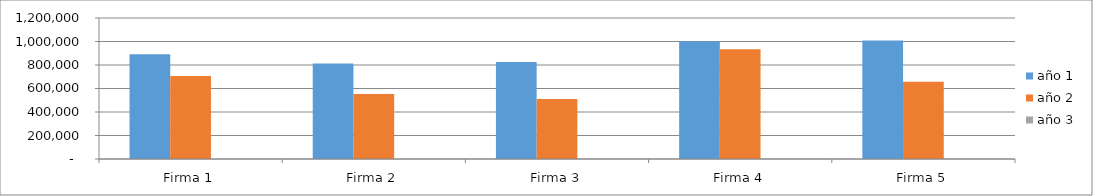
| Category | año 1 | año 2 | año 3 |
|---|---|---|---|
| Firma 1 | 890450.022 | 707381.085 | 0 |
| Firma 2 | 812025.331 | 553745.113 | 0 |
| Firma 3 | 825124.008 | 509789.755 | 0 |
| Firma 4 | 1001719.655 | 935034.101 | 0 |
| Firma 5 | 1007894.408 | 656943.693 | 0 |